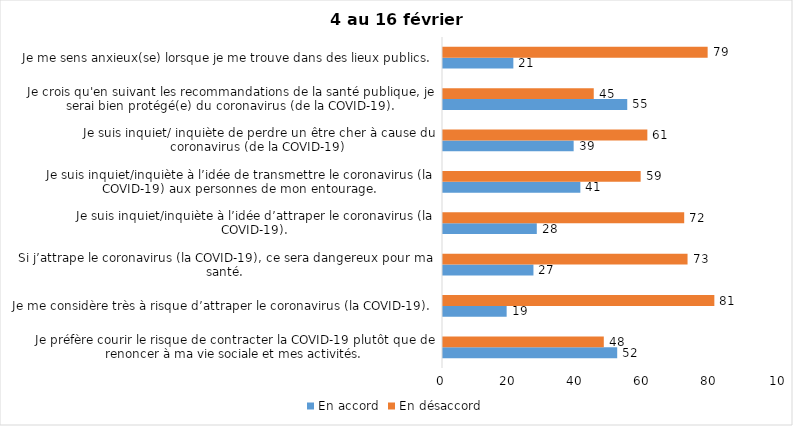
| Category | En accord | En désaccord |
|---|---|---|
| Je préfère courir le risque de contracter la COVID-19 plutôt que de renoncer à ma vie sociale et mes activités. | 52 | 48 |
| Je me considère très à risque d’attraper le coronavirus (la COVID-19). | 19 | 81 |
| Si j’attrape le coronavirus (la COVID-19), ce sera dangereux pour ma santé. | 27 | 73 |
| Je suis inquiet/inquiète à l’idée d’attraper le coronavirus (la COVID-19). | 28 | 72 |
| Je suis inquiet/inquiète à l’idée de transmettre le coronavirus (la COVID-19) aux personnes de mon entourage. | 41 | 59 |
| Je suis inquiet/ inquiète de perdre un être cher à cause du coronavirus (de la COVID-19) | 39 | 61 |
| Je crois qu'en suivant les recommandations de la santé publique, je serai bien protégé(e) du coronavirus (de la COVID-19). | 55 | 45 |
| Je me sens anxieux(se) lorsque je me trouve dans des lieux publics. | 21 | 79 |